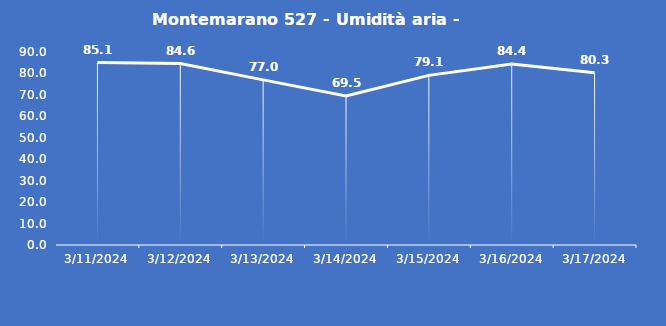
| Category | Montemarano 527 - Umidità aria - Grezzo (%) |
|---|---|
| 3/11/24 | 85.1 |
| 3/12/24 | 84.6 |
| 3/13/24 | 77 |
| 3/14/24 | 69.5 |
| 3/15/24 | 79.1 |
| 3/16/24 | 84.4 |
| 3/17/24 | 80.3 |